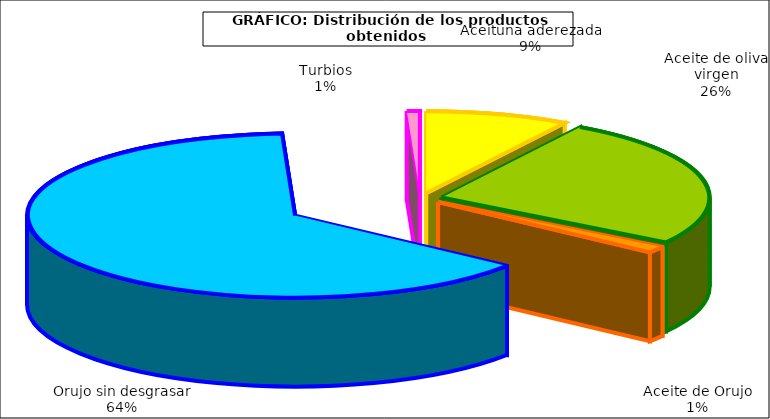
| Category | Series 1 |
|---|---|
| 0 | 604104 |
| 1 | 1790309 |
| 2 | 89913 |
| 3 | 4459208 |
| 4 | 54226 |